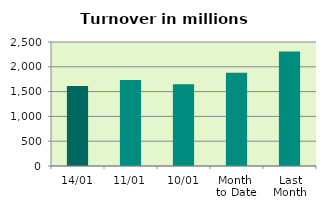
| Category | Series 0 |
|---|---|
| 14/01 | 1613.216 |
| 11/01 | 1731.532 |
| 10/01 | 1647.551 |
| Month 
to Date | 1878.422 |
| Last
Month | 2307.928 |